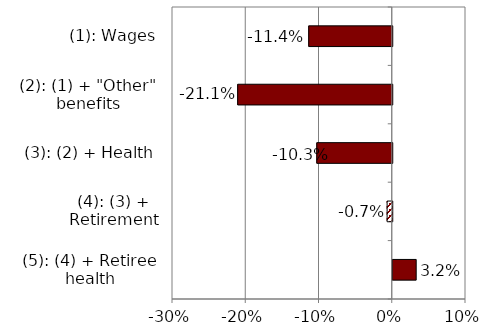
| Category | Series 0 |
|---|---|
| (5): (4) + Retiree health | 0.032 |
| (4): (3) + Retirement | -0.007 |
| (3): (2) + Health | -0.103 |
| (2): (1) + "Other" benefits | -0.211 |
| (1): Wages | -0.114 |